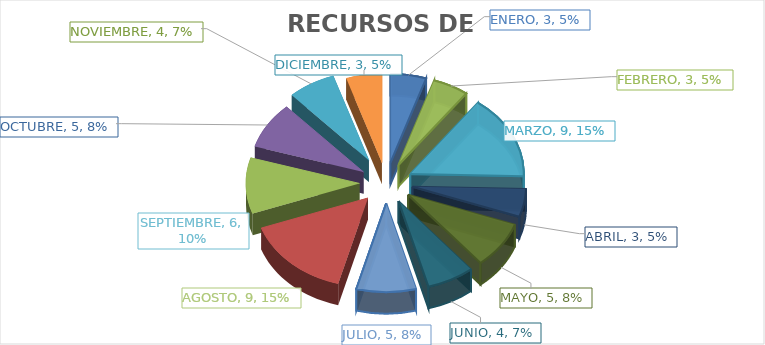
| Category | RECURSOS DE REVISION |
|---|---|
| ENERO | 3 |
| FEBRERO | 3 |
| MARZO | 9 |
| ABRIL | 3 |
| MAYO | 5 |
| JUNIO | 4 |
| JULIO | 5 |
| AGOSTO | 9 |
| SEPTIEMBRE | 6 |
| OCTUBRE | 5 |
| NOVIEMBRE | 4 |
| DICIEMBRE | 3 |